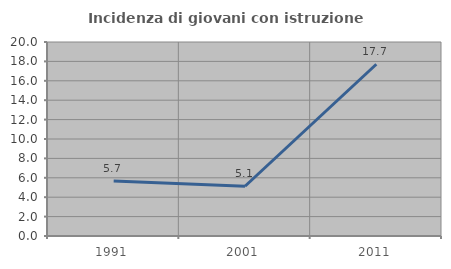
| Category | Incidenza di giovani con istruzione universitaria |
|---|---|
| 1991.0 | 5.66 |
| 2001.0 | 5.128 |
| 2011.0 | 17.708 |